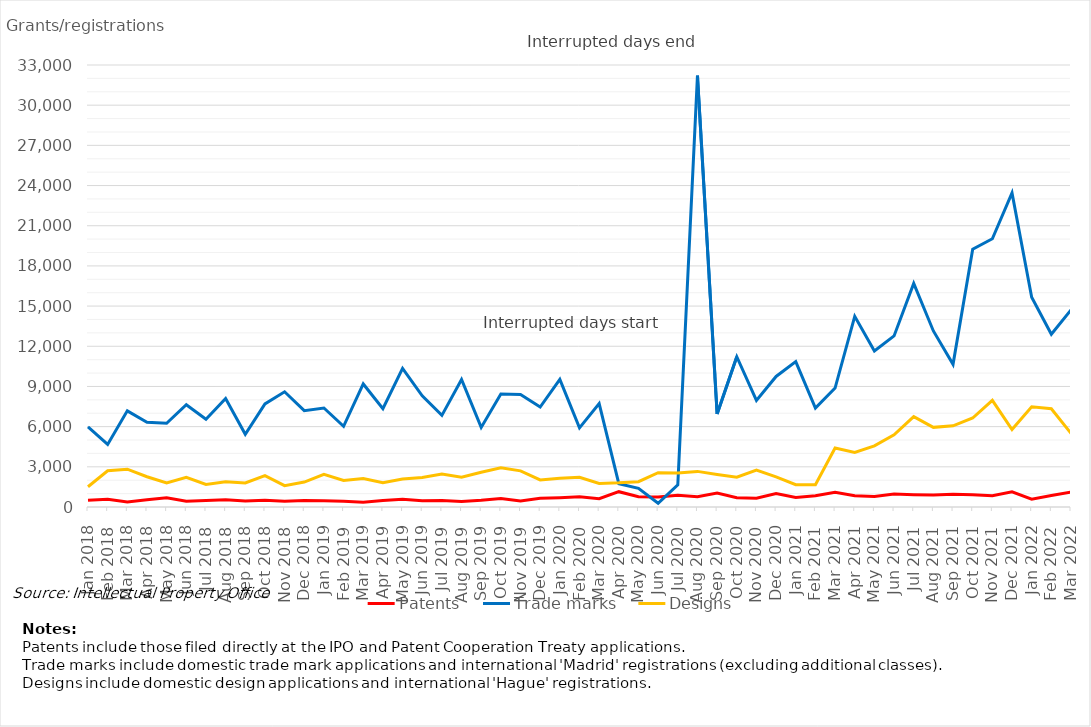
| Category | Patents | Trade marks | Designs |
|---|---|---|---|
| Jan 2018 | 495 | 5979 | 1512 |
| Feb 2018 | 574 | 4671 | 2704 |
| Mar 2018 | 370 | 7178 | 2825 |
| Apr 2018 | 543 | 6332 | 2259 |
| May 2018 | 690 | 6252 | 1789 |
| Jun 2018 | 424 | 7636 | 2222 |
| Jul 2018 | 486 | 6548 | 1678 |
| Aug 2018 | 536 | 8103 | 1878 |
| Sep 2018 | 450 | 5429 | 1795 |
| Oct 2018 | 498 | 7701 | 2348 |
| Nov 2018 | 432 | 8603 | 1592 |
| Dec 2018 | 484 | 7190 | 1859 |
| Jan 2019 | 474 | 7392 | 2444 |
| Feb 2019 | 426 | 6023 | 1987 |
| Mar 2019 | 363 | 9186 | 2125 |
| Apr 2019 | 488 | 7335 | 1810 |
| May 2019 | 573 | 10344 | 2096 |
| Jun 2019 | 471 | 8304 | 2202 |
| Jul 2019 | 489 | 6839 | 2464 |
| Aug 2019 | 420 | 9518 | 2218 |
| Sep 2019 | 500 | 5943 | 2596 |
| Oct 2019 | 634 | 8435 | 2926 |
| Nov 2019 | 455 | 8399 | 2700 |
| Dec 2019 | 654 | 7465 | 2021 |
| Jan 2020 | 696 | 9525 | 2145 |
| Feb 2020 | 756 | 5906 | 2220 |
| Mar 2020 | 622 | 7722 | 1757 |
| Apr 2020 | 1143 | 1742 | 1803 |
| May 2020 | 768 | 1398 | 1888 |
| Jun 2020 | 740 | 280 | 2564 |
| Jul 2020 | 878 | 1659 | 2539 |
| Aug 2020 | 771 | 32204 | 2659 |
| Sep 2020 | 1042 | 6946 | 2425 |
| Oct 2020 | 697 | 11218 | 2223 |
| Nov 2020 | 649 | 7954 | 2763 |
| Dec 2020 | 1010 | 9746 | 2252 |
| Jan 2021 | 708 | 10856 | 1665 |
| Feb 2021 | 838 | 7380 | 1660 |
| Mar 2021 | 1107 | 8877 | 4408 |
| Apr 2021 | 838 | 14232 | 4075 |
| May 2021 | 788 | 11653 | 4562 |
| Jun 2021 | 972 | 12772 | 5390 |
| Jul 2021 | 918 | 16695 | 6744 |
| Aug 2021 | 887 | 13144 | 5946 |
| Sep 2021 | 947 | 10649 | 6061 |
| Oct 2021 | 920 | 19253 | 6644 |
| Nov 2021 | 841 | 20028 | 7960 |
| Dec 2021 | 1131 | 23452 | 5781 |
| Jan 2022 | 585 | 15662 | 7482 |
| Feb 2022 | 860 | 12893 | 7338 |
| Mar 2022 | 1111 | 14715 | 5496 |